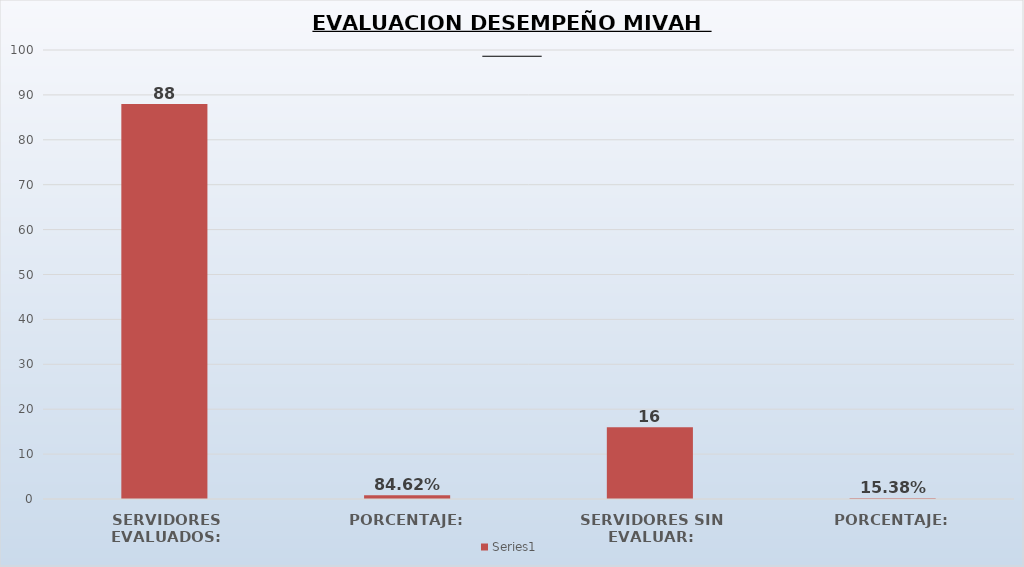
| Category | Series 1 |
|---|---|
| SERVIDORES EVALUADOS: | 88 |
| PORCENTAJE: | 0.846 |
| SERVIDORES SIN EVALUAR: | 16 |
| PORCENTAJE: | 0.154 |